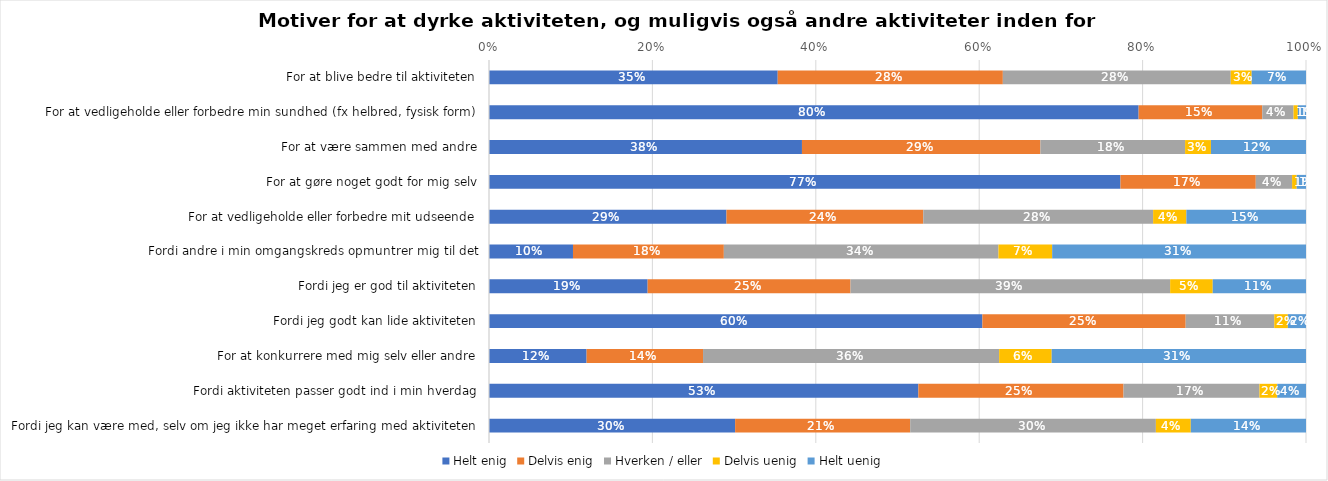
| Category | Helt enig | Delvis enig | Hverken / eller | Delvis uenig | Helt uenig |
|---|---|---|---|---|---|
| For at blive bedre til aktiviteten | 0.353 | 0.276 | 0.279 | 0.026 | 0.066 |
| For at vedligeholde eller forbedre min sundhed (fx helbred, fysisk form) | 0.795 | 0.151 | 0.038 | 0.005 | 0.01 |
| For at være sammen med andre | 0.383 | 0.292 | 0.177 | 0.032 | 0.116 |
| For at gøre noget godt for mig selv | 0.773 | 0.166 | 0.044 | 0.006 | 0.011 |
| For at vedligeholde eller forbedre mit udseende | 0.291 | 0.241 | 0.281 | 0.041 | 0.146 |
| Fordi andre i min omgangskreds opmuntrer mig til det | 0.103 | 0.185 | 0.336 | 0.066 | 0.311 |
| Fordi jeg er god til aktiviteten | 0.194 | 0.248 | 0.391 | 0.052 | 0.114 |
| Fordi jeg godt kan lide aktiviteten | 0.604 | 0.249 | 0.108 | 0.017 | 0.022 |
| For at konkurrere med mig selv eller andre | 0.119 | 0.143 | 0.362 | 0.064 | 0.311 |
| Fordi aktiviteten passer godt ind i min hverdag | 0.526 | 0.251 | 0.166 | 0.022 | 0.035 |
| Fordi jeg kan være med, selv om jeg ikke har meget erfaring med aktiviteten | 0.301 | 0.214 | 0.301 | 0.043 | 0.141 |